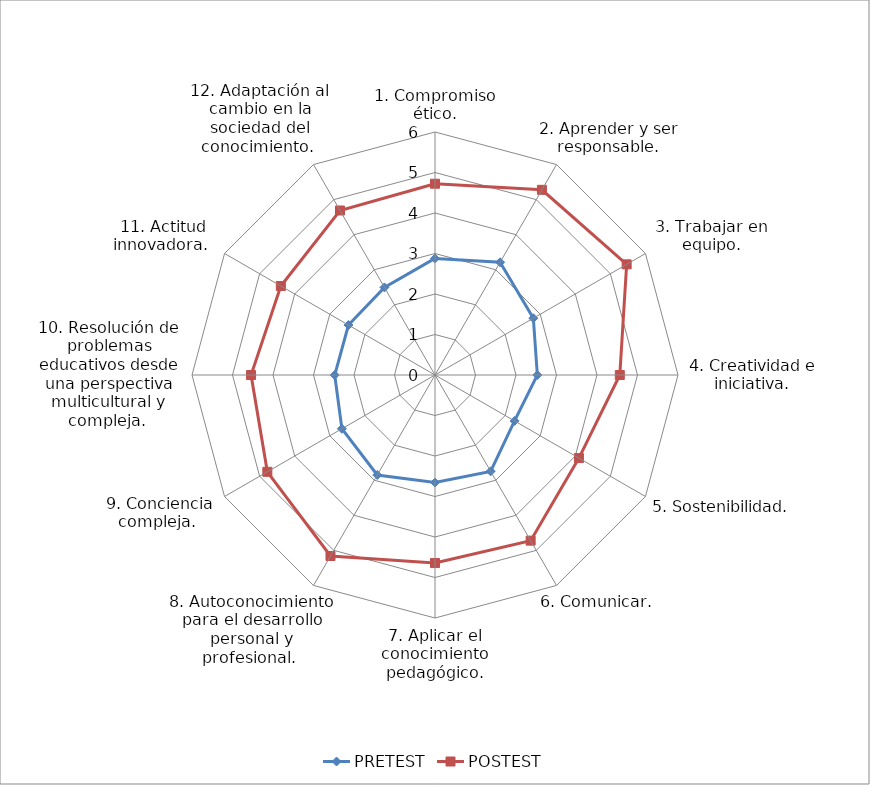
| Category | PRETEST | POSTEST |
|---|---|---|
| 1. Compromiso ético. | 2.88 | 4.723 |
| 2. Aprender y ser responsable. | 3.214 | 5.28 |
| 3. Trabajar en equipo. | 2.804 | 5.464 |
| 4. Creatividad e iniciativa. | 2.527 | 4.563 |
| 5. Sostenibilidad.  | 2.268 | 4.104 |
| 6. Comunicar. | 2.747 | 4.723 |
| 7. Aplicar el conocimiento pedagógico. | 2.655 | 4.643 |
| 8. Autoconocimiento para el desarrollo personal y profesional.  | 2.851 | 5.161 |
| 9. Conciencia compleja.  | 2.655 | 4.78 |
| 10. Resolución de problemas educativos desde una perspectiva multicultural y compleja.  | 2.476 | 4.542 |
| 11. Actitud innovadora.  | 2.467 | 4.395 |
| 12. Adaptación al cambio en la sociedad del conocimiento.  | 2.497 | 4.691 |